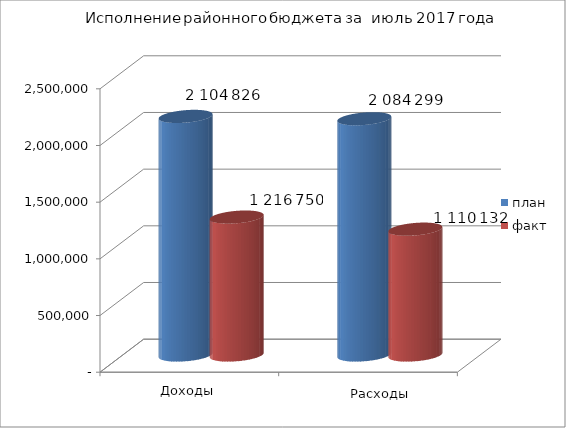
| Category | план | факт |
|---|---|---|
| 0 | 2104826 | 1216750 |
| 1 | 2084299 | 1110131.9 |